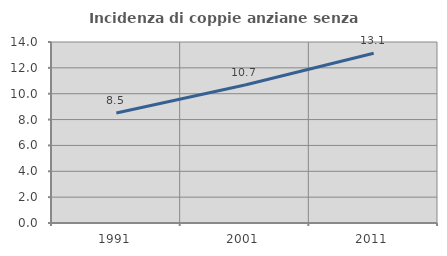
| Category | Incidenza di coppie anziane senza figli  |
|---|---|
| 1991.0 | 8.514 |
| 2001.0 | 10.671 |
| 2011.0 | 13.129 |